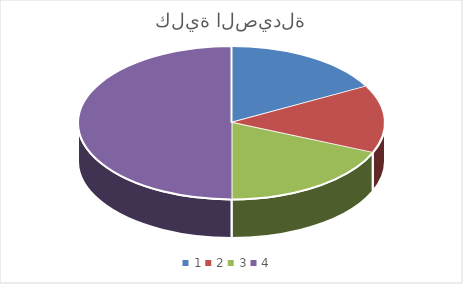
| Category | كلية الصيدلة | كلية العلوم | كلية الزراعة | كلية التجارة |
|---|---|---|---|---|
| 0 | 120 | 400 | 70 | 800 |
| 1 | 100 | 350 | 66 | 777 |
| 2 | 130 | 375 | 78 | 820 |
| 3 | 350 | 1125 | 214 | 2397 |